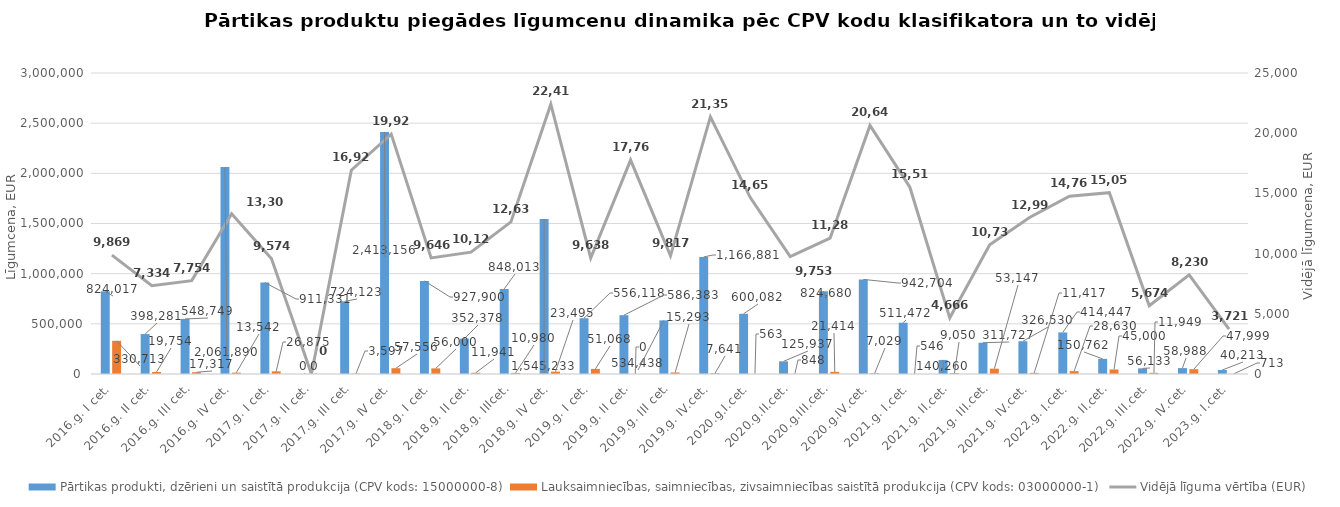
| Category | Pārtikas produkti, dzērieni un saistītā produkcija (CPV kods: 15000000-8) | Lauksaimniecības, saimniecības, zivsaimniecības saistītā produkcija (CPV kods: 03000000-1) |
|---|---|---|
| 2016.g. I cet. | 824017 | 330713 |
| 2016.g. II cet. | 398281 | 19754 |
| 2016.g. III cet. | 548749.01 | 17317 |
| 2016.g. IV cet. | 2061890 | 13542 |
| 2017.g. I cet. | 911330.81 | 26874.91 |
| 2017.g. II cet. | 0 | 0 |
| 2017.g. III cet. | 724123.07 | 3596.6 |
| 2017.g. IV cet. | 2413156 | 57556 |
| 2018.g. I cet. | 927900 | 56000 |
| 2018.g. II cet. | 352378 | 11941 |
| 2018.g. IIIcet. | 848013 | 10980 |
| 2018.g. IV cet. | 1545233 | 23495 |
| 2019.g. I cet. | 556118 | 51068 |
| 2019.g. II cet. | 586383 | 0 |
| 2019.g. III cet. | 534438 | 15293 |
| 2019.g. IV.cet. | 1166881 | 7641 |
| 2020.g.I.cet. | 600082 | 563 |
| 2020.g.II.cet. | 125937 | 848 |
| 2020.g.III.cet. | 824680 | 21414 |
| 2020.g.IV.cet. | 942704 | 7029 |
| 2021.g. I.cet. | 511472 | 546 |
| 2021.g. II.cet. | 140260 | 9050 |
| 2021.g. III.cet. | 311727 | 53147 |
| 2021.g. IV.cet. | 326530 | 11417 |
| 2022.g. I.cet. | 414447 | 28630 |
| 2022.g. II.cet. | 150762 | 45000 |
| 2022.g. III.cet. | 56133 | 11949 |
| 2022.g. IV.cet. | 58988 | 47999 |
| 2023.g. I.cet. | 40213 | 713 |